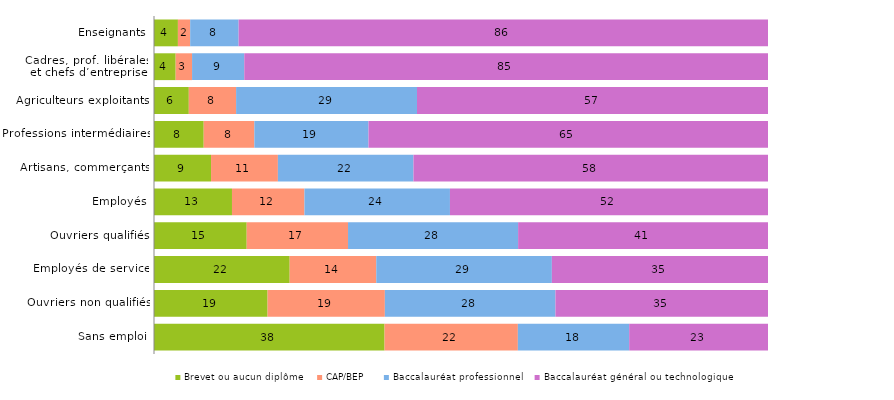
| Category | Brevet ou aucun diplôme | CAP/BEP | Baccalauréat professionnel | Baccalauréat général ou technologique |
|---|---|---|---|---|
| Enseignants | 3.9 | 2 | 7.9 | 86.33 |
| Cadres, prof. libérales
 et chefs d’entreprise | 3.53 | 2.67 | 8.5 | 85.3 |
| Agriculteurs exploitants | 5.67 | 7.7 | 29.46 | 57.16 |
| Professions intermédiaires | 8.1 | 8.25 | 18.6 | 65.1 |
| Artisans, commerçants | 9.3 | 10.9 | 22.1 | 57.8 |
| Employés | 12.7 | 11.8 | 23.7 | 51.8 |
| Ouvriers qualifiés | 15.1 | 16.5 | 27.7 | 40.7 |
| Employés de service | 22.1 | 14.1 | 28.6 | 35.2 |
| Ouvriers non qualifiés | 18.5 | 19.1 | 27.78 | 34.62 |
| Sans emploi | 37.7 | 21.8 | 18.2 | 22.7 |